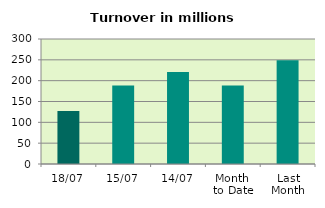
| Category | Series 0 |
|---|---|
| 18/07 | 127.149 |
| 15/07 | 188.522 |
| 14/07 | 220.929 |
| Month 
to Date | 188.332 |
| Last
Month | 248.976 |